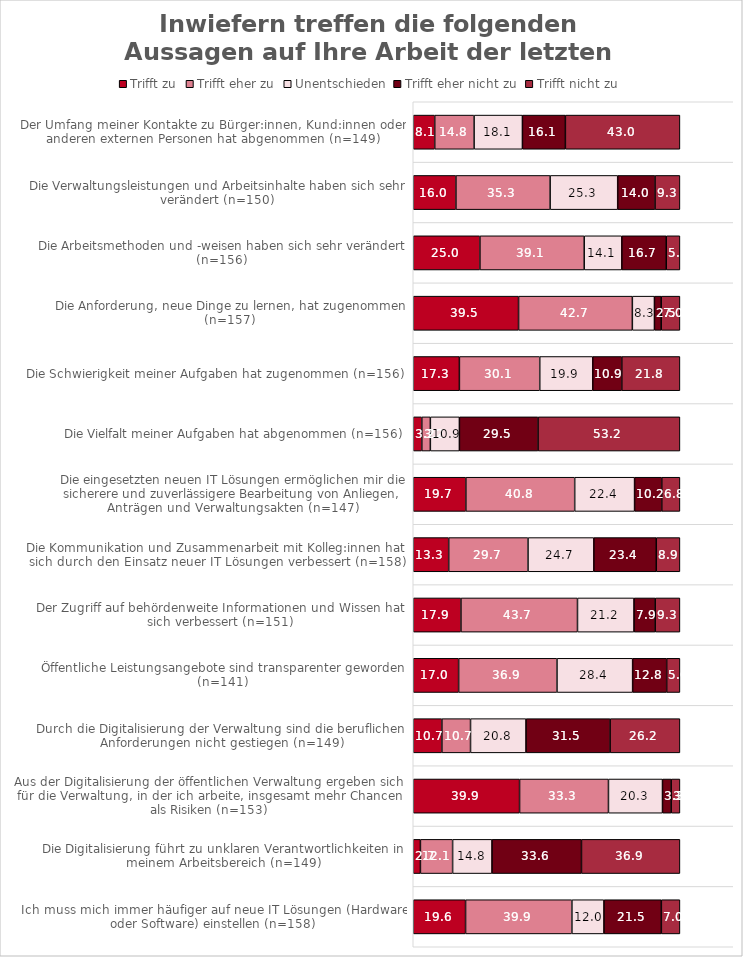
| Category | Trifft zu | Trifft eher zu | Unentschieden | Trifft eher nicht zu | Trifft nicht zu |
|---|---|---|---|---|---|
| Ich muss mich immer häufiger auf neue IT Lösungen (Hardware oder Software) einstellen (n=158) | 19.62 | 39.873 | 12.025 | 21.519 | 6.962 |
| Die Digitalisierung führt zu unklaren Verantwortlichkeiten in meinem Arbeitsbereich (n=149) | 2.685 | 12.081 | 14.765 | 33.557 | 36.913 |
| Aus der Digitalisierung der öffentlichen Verwaltung ergeben sich für die Verwaltung, in der ich arbeite, insgesamt mehr Chancen als Risiken (n=153) | 39.869 | 33.333 | 20.261 | 3.268 | 3.268 |
| Durch die Digitalisierung der Verwaltung sind die beruflichen Anforderungen nicht gestiegen (n=149) | 10.738 | 10.738 | 20.805 | 31.544 | 26.174 |
| Öffentliche Leistungsangebote sind transparenter geworden (n=141) | 17.021 | 36.879 | 28.369 | 12.766 | 4.965 |
| Der Zugriff auf behördenweite Informationen und Wissen hat sich verbessert (n=151) | 17.881 | 43.709 | 21.192 | 7.947 | 9.272 |
| Die Kommunikation und Zusammenarbeit mit Kolleg:innen hat sich durch den Einsatz neuer IT Lösungen verbessert (n=158) | 13.291 | 29.747 | 24.684 | 23.418 | 8.861 |
| Die eingesetzten neuen IT Lösungen ermöglichen mir die sicherere und zuverlässigere Bearbeitung von Anliegen, Anträgen und Verwaltungsakten (n=147) | 19.728 | 40.816 | 22.449 | 10.204 | 6.803 |
| Die Vielfalt meiner Aufgaben hat abgenommen (n=156) | 3.205 | 3.205 | 10.897 | 29.487 | 53.205 |
| Die Schwierigkeit meiner Aufgaben hat zugenommen (n=156) | 17.308 | 30.128 | 19.872 | 10.897 | 21.795 |
| Die Anforderung, neue Dinge zu lernen, hat zugenommen (n=157) | 39.49 | 42.675 | 8.28 | 2.548 | 7.006 |
| Die Arbeitsmethoden und -weisen haben sich sehr verändert (n=156) | 25 | 39.103 | 14.103 | 16.667 | 5.128 |
| Die Verwaltungsleistungen und Arbeitsinhalte haben sich sehr verändert (n=150) | 16 | 35.333 | 25.333 | 14 | 9.333 |
| Der Umfang meiner Kontakte zu Bürger:innen, Kund:innen oder anderen externen Personen hat abgenommen (n=149) | 8.054 | 14.765 | 18.121 | 16.107 | 42.953 |